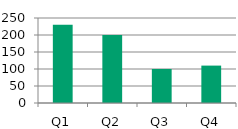
| Category | Series 0 |
|---|---|
| Q1 | 230 |
| Q2 | 200 |
| Q3 | 100 |
| Q4 | 110 |